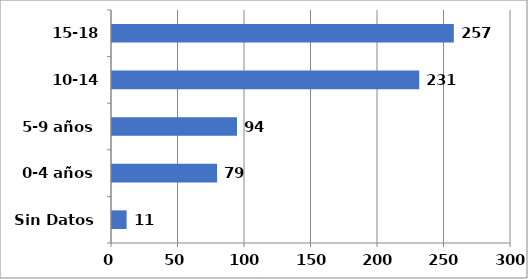
| Category | Series 0 |
|---|---|
| Sin Datos | 11 |
| 0-4 años | 79 |
| 5-9 años | 94 |
| 10-14 años | 231 |
| 15-18 años | 257 |